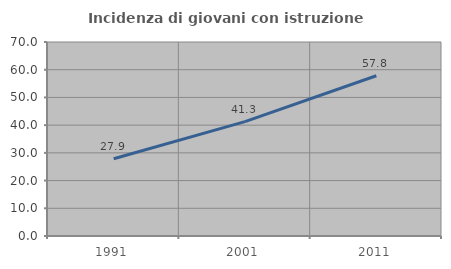
| Category | Incidenza di giovani con istruzione universitaria |
|---|---|
| 1991.0 | 27.875 |
| 2001.0 | 41.264 |
| 2011.0 | 57.831 |